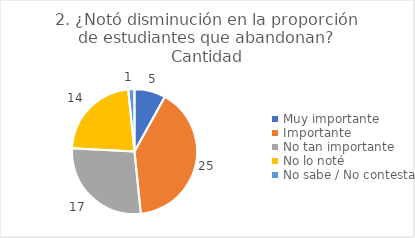
| Category | 2. ¿Notó disminución en la proporción de estudiantes que abandonan? |
|---|---|
| Muy importante  | 0.081 |
| Importante  | 0.403 |
| No tan importante  | 0.274 |
| No lo noté  | 0.226 |
| No sabe / No contesta | 0.016 |